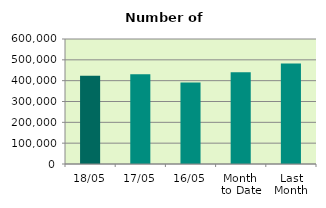
| Category | Series 0 |
|---|---|
| 18/05 | 423750 |
| 17/05 | 430804 |
| 16/05 | 391674 |
| Month 
to Date | 439902.615 |
| Last
Month | 481931.444 |